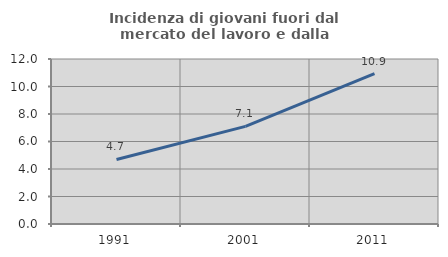
| Category | Incidenza di giovani fuori dal mercato del lavoro e dalla formazione  |
|---|---|
| 1991.0 | 4.691 |
| 2001.0 | 7.102 |
| 2011.0 | 10.933 |